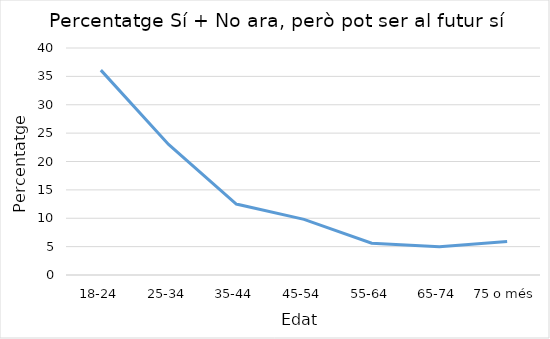
| Category | Series 0 |
|---|---|
| 18-24 | 36.1 |
| 25-34 | 23 |
| 35-44 | 12.5 |
| 45-54 | 9.8 |
| 55-64 | 5.6 |
| 65-74 | 5 |
| 75 o més | 5.9 |